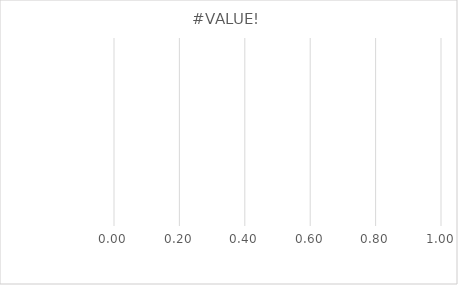
| Category | Benchmark | Entire LEA  | Title IV-A Identified Schools |
|---|---|---|---|
| 0.0 | 0 | 0 | 0 |